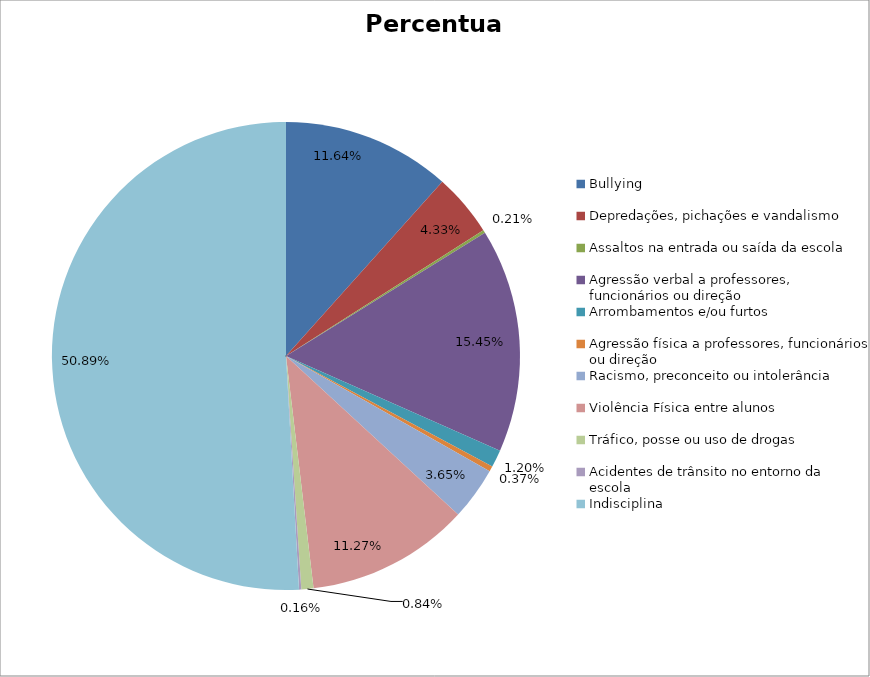
| Category | Percentual |
|---|---|
| Bullying | 0.116 |
| Depredações, pichações e vandalismo | 0.043 |
| Assaltos na entrada ou saída da escola | 0.002 |
| Agressão verbal a professores, funcionários ou direção | 0.154 |
| Arrombamentos e/ou furtos | 0.012 |
| Agressão física a professores, funcionários ou direção | 0.004 |
| Racismo, preconceito ou intolerância | 0.037 |
| Violência Física entre alunos | 0.113 |
| Tráfico, posse ou uso de drogas | 0.008 |
| Acidentes de trânsito no entorno da escola | 0.002 |
| Indisciplina | 0.509 |